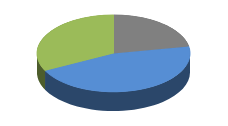
| Category | Series 0 |
|---|---|
| Garbage | 0.17 |
| Recyclable | 0.35 |
| Compostable | 0.25 |